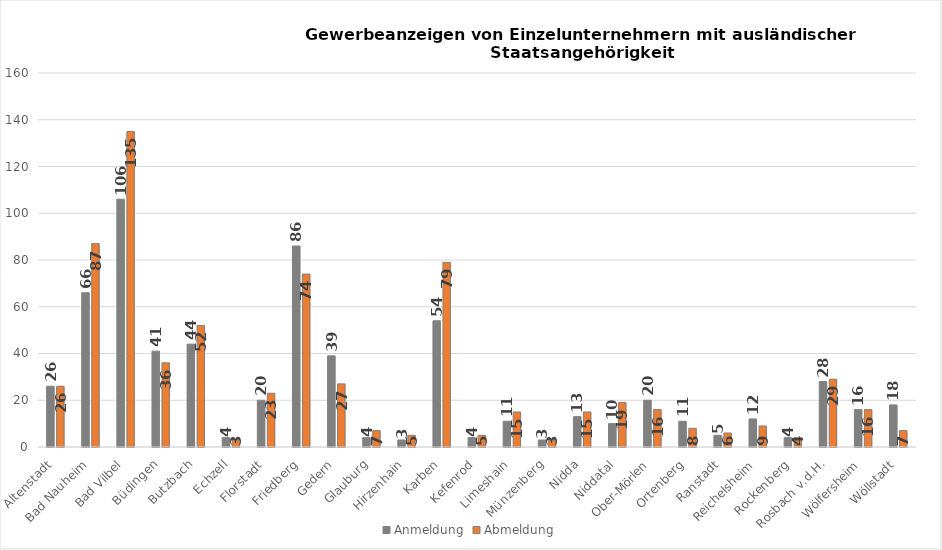
| Category | Anmeldung | Abmeldung |
|---|---|---|
| Altenstadt | 26 | 26 |
| Bad Nauheim | 66 | 87 |
| Bad Vilbel | 106 | 135 |
| Büdingen | 41 | 36 |
| Butzbach | 44 | 52 |
| Echzell | 4 | 3 |
| Florstadt | 20 | 23 |
| Friedberg | 86 | 74 |
| Gedern | 39 | 27 |
| Glauburg | 4 | 7 |
| Hirzenhain | 3 | 5 |
| Karben | 54 | 79 |
| Kefenrod | 4 | 5 |
| Limeshain | 11 | 15 |
| Münzenberg | 3 | 3 |
| Nidda | 13 | 15 |
| Niddatal | 10 | 19 |
| Ober-Mörlen | 20 | 16 |
| Ortenberg | 11 | 8 |
| Ranstadt | 5 | 6 |
| Reichelsheim | 12 | 9 |
| Rockenberg | 4 | 4 |
| Rosbach v.d.H. | 28 | 29 |
| Wölfersheim | 16 | 16 |
| Wöllstadt | 18 | 7 |